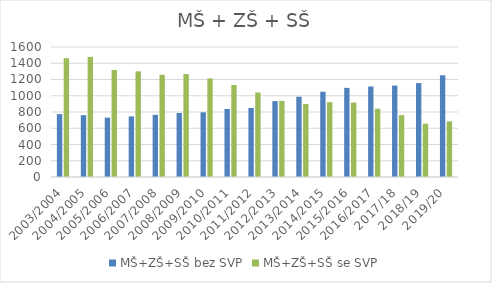
| Category | MŠ+ZŠ+SŠ bez SVP | MŠ+ZŠ+SŠ se SVP |
|---|---|---|
| 2003/2004 | 774 | 1462 |
| 2004/2005 | 761 | 1478 |
| 2005/2006 | 730 | 1317 |
| 2006/2007 | 746 | 1301 |
| 2007/2008 | 765 | 1258 |
| 2008/2009 | 788 | 1267 |
| 2009/2010 | 796 | 1213 |
| 2010/2011 | 837 | 1132 |
| 2011/2012 | 849 | 1040 |
| 2012/2013 | 934 | 937 |
| 2013/2014 | 988 | 898 |
| 2014/2015 | 1049 | 922 |
| 2015/2016 | 1097 | 916 |
| 2016/2017 | 1114 | 841 |
| 2017/18 | 1125 | 761 |
| 2018/19 | 1156 | 657 |
| 2019/20 | 1252 | 685 |